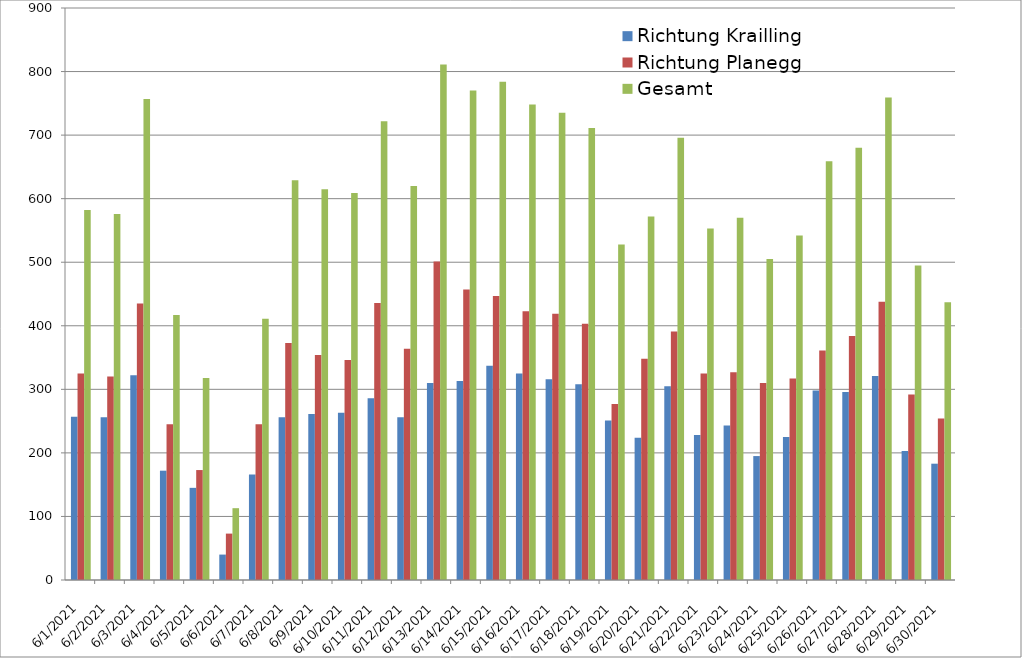
| Category | Richtung Krailling | Richtung Planegg | Gesamt |
|---|---|---|---|
| 6/1/21 | 257 | 325 | 582 |
| 6/2/21 | 256 | 320 | 576 |
| 6/3/21 | 322 | 435 | 757 |
| 6/4/21 | 172 | 245 | 417 |
| 6/5/21 | 145 | 173 | 318 |
| 6/6/21 | 40 | 73 | 113 |
| 6/7/21 | 166 | 245 | 411 |
| 6/8/21 | 256 | 373 | 629 |
| 6/9/21 | 261 | 354 | 615 |
| 6/10/21 | 263 | 346 | 609 |
| 6/11/21 | 286 | 436 | 722 |
| 6/12/21 | 256 | 364 | 620 |
| 6/13/21 | 310 | 501 | 811 |
| 6/14/21 | 313 | 457 | 770 |
| 6/15/21 | 337 | 447 | 784 |
| 6/16/21 | 325 | 423 | 748 |
| 6/17/21 | 316 | 419 | 735 |
| 6/18/21 | 308 | 403 | 711 |
| 6/19/21 | 251 | 277 | 528 |
| 6/20/21 | 224 | 348 | 572 |
| 6/21/21 | 305 | 391 | 696 |
| 6/22/21 | 228 | 325 | 553 |
| 6/23/21 | 243 | 327 | 570 |
| 6/24/21 | 195 | 310 | 505 |
| 6/25/21 | 225 | 317 | 542 |
| 6/26/21 | 298 | 361 | 659 |
| 6/27/21 | 296 | 384 | 680 |
| 6/28/21 | 321 | 438 | 759 |
| 6/29/21 | 203 | 292 | 495 |
| 6/30/21 | 183 | 254 | 437 |